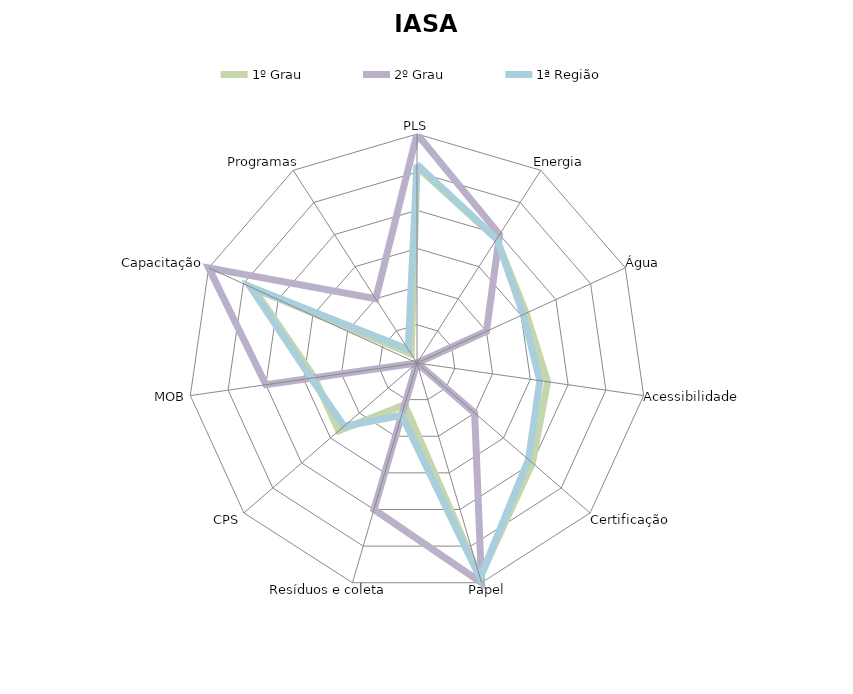
| Category | 1º Grau | 2º Grau | 1ª Região |
|---|---|---|---|
| PLS | 2.571 | 3 | 2.6 |
| Energia | 1.929 | 2 | 1.933 |
| Água | 1.571 | 1 | 1.53 |
| Acessibilidade | 1.729 | 0 | 1.626 |
| Certificação | 2 | 1 | 1.933 |
| Papel | 2.929 | 3 | 2.933 |
| Resíduos e coleta | 0.571 | 2 | 0.714 |
| CPS | 1.357 | 0 | 1.266 |
| MOB | 1.357 | 2 | 1.4 |
| Capacitação | 2.357 | 3 | 2.4 |
| Programas | 0.143 | 1 | 0.214 |